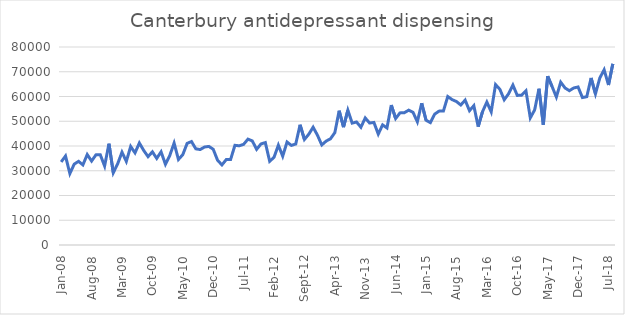
| Category | Series 0 |
|---|---|
| 2008-01-01 | 33567 |
| 2008-02-01 | 35954 |
| 2008-03-01 | 28857.5 |
| 2008-04-01 | 32671 |
| 2008-05-01 | 33803.5 |
| 2008-06-01 | 32360.5 |
| 2008-07-01 | 36544.5 |
| 2008-08-01 | 33909 |
| 2008-09-01 | 36418.5 |
| 2008-10-01 | 36467.5 |
| 2008-11-01 | 31905 |
| 2008-12-01 | 40926 |
| 2009-01-01 | 29198 |
| 2009-02-01 | 32777 |
| 2009-03-01 | 37503 |
| 2009-04-01 | 33773.5 |
| 2009-05-01 | 39810 |
| 2009-06-01 | 37232.5 |
| 2009-07-01 | 41210 |
| 2009-08-01 | 38211.5 |
| 2009-09-01 | 35700.5 |
| 2009-10-01 | 37645.5 |
| 2009-11-01 | 34989 |
| 2009-12-01 | 37646.5 |
| 2010-01-01 | 32630.5 |
| 2010-02-01 | 36151 |
| 2010-03-01 | 41182 |
| 2010-04-01 | 34546 |
| 2010-05-01 | 36518 |
| 2010-06-01 | 41060 |
| 2010-07-01 | 41802 |
| 2010-08-01 | 38854.5 |
| 2010-09-01 | 38559.75 |
| 2010-10-01 | 39590.25 |
| 2010-11-01 | 39830.5 |
| 2010-12-01 | 38683.75 |
| 2011-01-01 | 34278 |
| 2011-02-01 | 32357.5 |
| 2011-03-01 | 34503.25 |
| 2011-04-01 | 34527.75 |
| 2011-05-01 | 40282 |
| 2011-06-01 | 40067.25 |
| 2011-07-01 | 40665 |
| 2011-08-01 | 42775.5 |
| 2011-09-01 | 42052.25 |
| 2011-10-01 | 38659 |
| 2011-11-01 | 40828.5 |
| 2011-12-01 | 41380 |
| 2012-01-01 | 33824 |
| 2012-02-01 | 35426 |
| 2012-03-01 | 40346.25 |
| 2012-04-01 | 35886.5 |
| 2012-05-01 | 41611.25 |
| 2012-06-01 | 40236 |
| 2012-07-01 | 40802 |
| 2012-08-01 | 48576.75 |
| 2012-09-01 | 42645.5 |
| 2012-10-01 | 44747.5 |
| 2012-11-01 | 47586.25 |
| 2012-12-01 | 44371.5 |
| 2013-01-01 | 40427.75 |
| 2013-02-01 | 41983.5 |
| 2013-03-01 | 42914 |
| 2013-04-01 | 45404.5 |
| 2013-05-01 | 54259.25 |
| 2013-06-01 | 47625 |
| 2013-07-01 | 54470.5 |
| 2013-08-01 | 49244.75 |
| 2013-09-01 | 49706.25 |
| 2013-10-01 | 47570.25 |
| 2013-11-01 | 51329 |
| 2013-12-01 | 49290.5 |
| 2014-01-01 | 49510.25 |
| 2014-02-01 | 44807.5 |
| 2014-03-01 | 48540 |
| 2014-04-01 | 47297.5 |
| 2014-05-01 | 56540.25 |
| 2014-06-01 | 51106.5 |
| 2014-07-01 | 53380.25 |
| 2014-08-01 | 53446 |
| 2014-09-01 | 54476.25 |
| 2014-10-01 | 53607.25 |
| 2014-11-01 | 49782 |
| 2014-12-01 | 57278.75 |
| 2015-01-01 | 50403 |
| 2015-02-01 | 49442 |
| 2015-03-01 | 52916.5 |
| 2015-04-01 | 54092 |
| 2015-05-01 | 54134 |
| 2015-06-01 | 59990 |
| 2015-07-01 | 58745 |
| 2015-08-01 | 57969 |
| 2015-09-01 | 56566 |
| 2015-10-01 | 58546.5 |
| 2015-11-01 | 54263 |
| 2015-12-01 | 56294.5 |
| 2016-01-01 | 47825.5 |
| 2016-02-01 | 53874 |
| 2016-03-01 | 57741.5 |
| 2016-04-01 | 53815.5 |
| 2016-05-01 | 64818 |
| 2016-06-01 | 62901.5 |
| 2016-07-01 | 58683 |
| 2016-08-01 | 61100 |
| 2016-09-01 | 64594 |
| 2016-10-01 | 60438 |
| 2016-11-01 | 60506.5 |
| 2016-12-01 | 62270.5 |
| 2017-01-01 | 51357 |
| 2017-02-01 | 54581.5 |
| 2017-03-01 | 63149 |
| 2017-04-01 | 48606.5 |
| 2017-05-01 | 68209 |
| 2017-06-01 | 64096.5 |
| 2017-07-01 | 59784.5 |
| 2017-08-01 | 65783 |
| 2017-09-01 | 63444.5 |
| 2017-10-01 | 62346.5 |
| 2017-11-01 | 63444 |
| 2017-12-01 | 63845 |
| 2018-01-01 | 59568 |
| 2018-02-01 | 59911.75 |
| 2018-03-01 | 67487.5 |
| 2018-04-01 | 61069.5 |
| 2018-05-01 | 67479 |
| 2018-06-01 | 70798.5 |
| 2018-07-01 | 64647.5 |
| 2018-08-01 | 73193.5 |